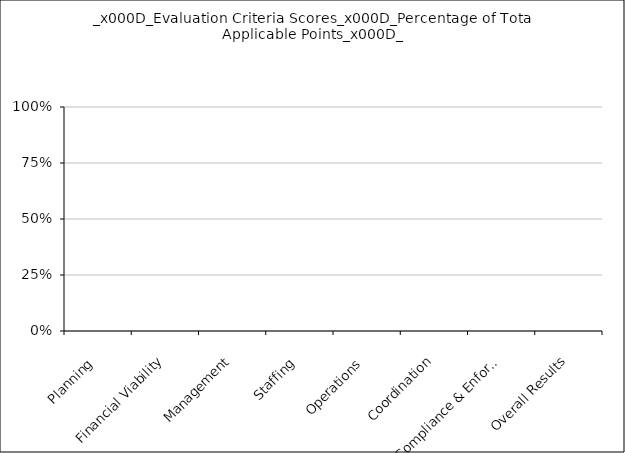
| Category | Series 0 |
|---|---|
| Planning | 0 |
| Financial Viability | 0 |
| Management | 0 |
| Staffing | 0 |
| Operations | 0 |
| Coordination | 0 |
| Compliance & Enforcement | 0 |
| Overall Results | 0 |